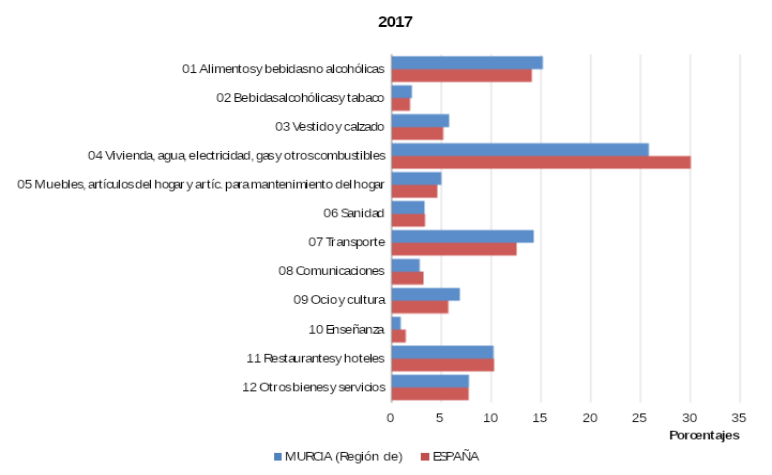
| Category | MURCIA (Región de) | ESPAÑA |
|---|---|---|
| 01 Alimentos y bebidas no alcohólicas | 15.19 | 14.07 |
| 02 Bebidas alcohólicas y tabaco | 2.05 | 1.84 |
| 03 Vestido y calzado | 5.78 | 5.19 |
| 04 Vivienda, agua, electricidad, gas y otros combustibles | 25.83 | 30.06 |
| 05 Muebles, artículos del hogar y artíc. para mantenimiento del hogar | 4.99 | 4.58 |
| 06 Sanidad | 3.29 | 3.36 |
| 07 Transporte | 14.28 | 12.56 |
| 08 Comunicaciones | 2.83 | 3.18 |
| 09 Ocio y cultura | 6.84 | 5.69 |
| 10 Enseñanza | 0.9 | 1.42 |
| 11 Restaurantes y hoteles | 10.25 | 10.29 |
| 12 Otros bienes y servicios | 7.77 | 7.75 |